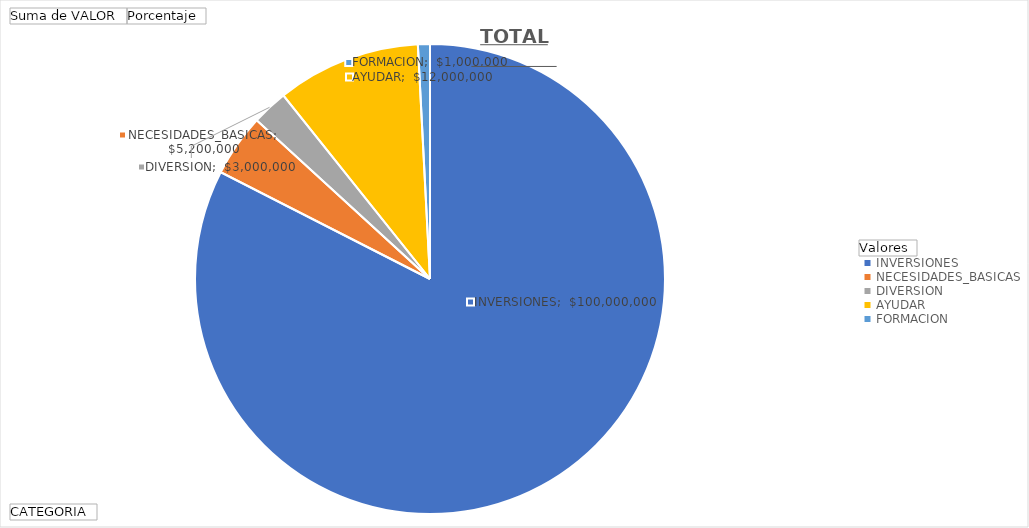
| Category | Suma de VALOR | Porcentaje |
|---|---|---|
| INVERSIONES | 100000000 | 0.825 |
| NECESIDADES_BASICAS | 5200000 | 0.043 |
| DIVERSION | 3000000 | 0.025 |
| AYUDAR | 12000000 | 0.099 |
| FORMACION | 1000000 | 0.008 |